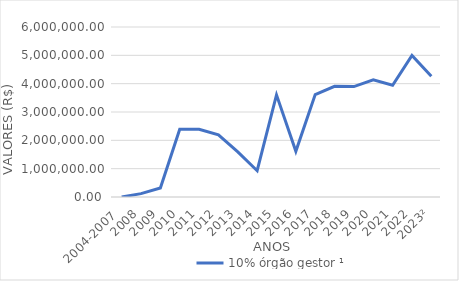
| Category | 10% órgão gestor ¹ |
|---|---|
| 2004-2007  | 0 |
| 2008 | 118987.11 |
| 2009 | 320407.84 |
| 2010 | 2388177.37 |
| 2011 | 2389298.87 |
| 2012 | 2193238.56 |
| 2013 | 1590720.05 |
| 2014 | 927863.12 |
| 2015 | 3604292 |
| 2016 | 1611910.67 |
| 2017 | 3616618.58 |
| 2018 | 3907326.19 |
| 2019 | 3896996.79 |
| 2020 | 4133384.69 |
| 2021 | 3944543.56 |
| 2022 | 4992618.75 |
| 2023² | 4259522.24 |